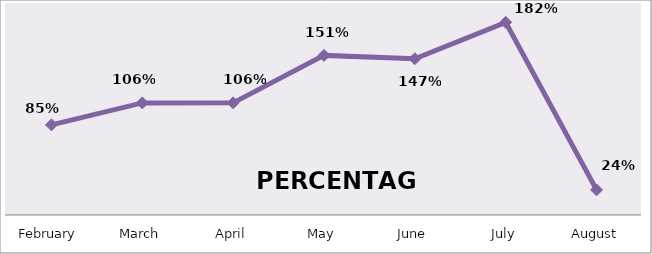
| Category | PERCENTAGE |
|---|---|
| February | 0.85 |
| March | 1.057 |
| April | 1.058 |
| May | 1.506 |
| June | 1.475 |
| July | 1.818 |
| August | 0.237 |